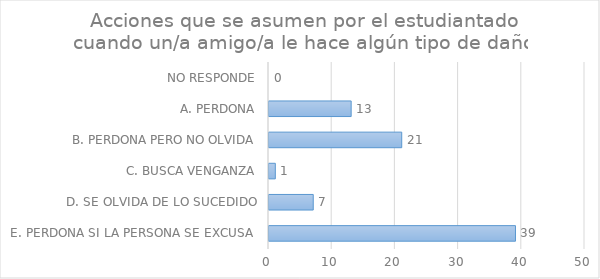
| Category | Series 0 |
|---|---|
| E. PERDONA SI LA PERSONA SE EXCUSA  | 39 |
| D. SE OLVIDA DE LO SUCEDIDO | 7 |
| C. BUSCA VENGANZA | 1 |
| B. PERDONA PERO NO OLVIDA | 21 |
| A. PERDONA | 13 |
| NO RESPONDE | 0 |